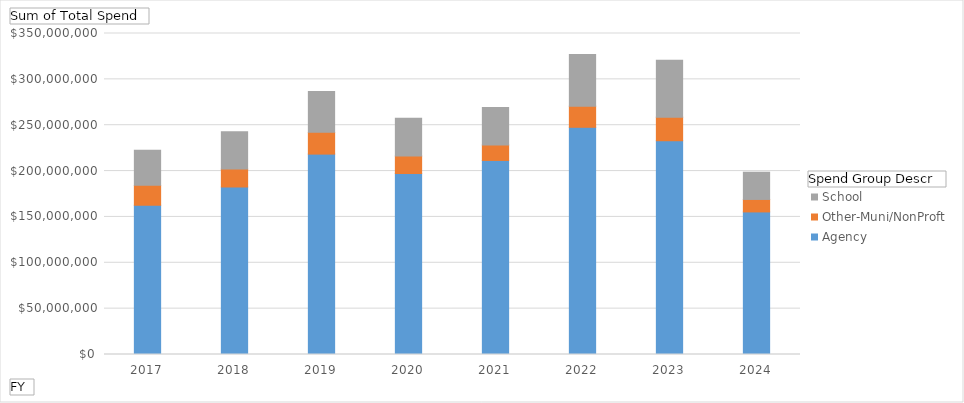
| Category | Agency | Other-Muni/NonProft | School |
|---|---|---|---|
| 2017 | 162739374.77 | 21763958.222 | 38264680.59 |
| 2018 | 182644066.15 | 19509578.92 | 40739531.67 |
| 2019 | 218499507.83 | 23786110 | 44372644.5 |
| 2020 | 197347832.01 | 19012390.05 | 41193009.15 |
| 2021 | 211578322.68 | 16939370.01 | 40846186.5 |
| 2022 | 247737574.5 | 23050588.93 | 56321742.43 |
| 2023 | 233069215.07 | 25716249.41 | 62125471.45 |
| 2024 | 155456269.73 | 13612146 | 29683825.51 |